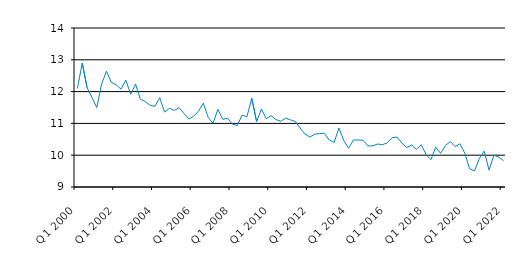
| Category | Series 0 |
|---|---|
| Q1 2000 | 12.1 |
| Q2 2000 | 12.899 |
| Q3 2000 | 12.125 |
| Q4 2000 | 11.812 |
| Q1 2001 | 11.5 |
| Q2 2001 | 12.241 |
| Q3 2001 | 12.642 |
| Q4 2001 | 12.291 |
| Q1 2002 | 12.215 |
| Q2 2002 | 12.075 |
| Q3 2002 | 12.36 |
| Q4 2002 | 11.917 |
| Q1 2003 | 12.236 |
| Q2 2003 | 11.761 |
| Q3 2003 | 11.688 |
| Q4 2003 | 11.569 |
| Q1 2004 | 11.539 |
| Q2 2004 | 11.807 |
| Q3 2004 | 11.354 |
| Q4 2004 | 11.477 |
| Q1 2005 | 11.406 |
| Q2 2005 | 11.493 |
| Q3 2005 | 11.318 |
| Q4 2005 | 11.136 |
| Q1 2006 | 11.231 |
| Q2 2006 | 11.38 |
| Q3 2006 | 11.64 |
| Q4 2006 | 11.19 |
| Q1 2007 | 11 |
| Q2 2007 | 11.44 |
| Q3 2007 | 11.13 |
| Q4 2007 | 11.16 |
| Q1 2008 | 10.98 |
| Q2 2008 | 10.93 |
| Q3 2008 | 11.26 |
| Q4 2008 | 11.21 |
| Q1 2009 | 11.79 |
| Q2 2009 | 11.06 |
| Q3 2009 | 11.45 |
| Q4 2009 | 11.15 |
| Q1 2010 | 11.24 |
| Q2 2010 | 11.12 |
| Q3 2010 | 11.067 |
| Q4 2010 | 11.166 |
| Q1 2011 | 11.11 |
| Q2 2011 | 11.06 |
| Q3 2011 | 10.855 |
| Q4 2011 | 10.66 |
| Q1 2012 | 10.57 |
| Q2 2012 | 10.66 |
| Q3 2012 | 10.68 |
| Q4 2012 | 10.69 |
| Q1 2013 | 10.48 |
| Q2 2013 | 10.4 |
| Q3 2013 | 10.85 |
| Q4 2013 | 10.46 |
| Q1 2014 | 10.22 |
| Q2 2014 | 10.479 |
| Q3 2014 | 10.48 |
| Q4 2014 | 10.47 |
| Q1 2015 | 10.29 |
| Q2 2015 | 10.295 |
| Q3 2015 | 10.352 |
| Q4 2015 | 10.33 |
| Q1 2016 | 10.39 |
| Q2 2016 | 10.55 |
| Q3 2016 | 10.57 |
| Q4 2016 | 10.38 |
| Q1 2017 | 10.24 |
| Q2 2017 | 10.32 |
| Q3 2017 | 10.18 |
| Q4 2017 | 10.33 |
| Q1 2018 | 10.02 |
| Q2 2018 | 9.86 |
| Q3 2018 | 10.251 |
| Q4 2018 | 10.06 |
| Q1 2019 | 10.308 |
| Q2 2019 | 10.429 |
| Q3 2019 | 10.27 |
| Q4 2019 | 10.36 |
| Q1 2020 | 10.06 |
| Q2 2020 | 9.57 |
| Q3 2020 | 9.51 |
| Q4 2020 | 9.9 |
| Q1 2021 | 10.128 |
| Q2 2021 | 9.53 |
| Q3 2021 | 10 |
| Q4 2021 | 9.94 |
| Q1 2022 | 9.83 |